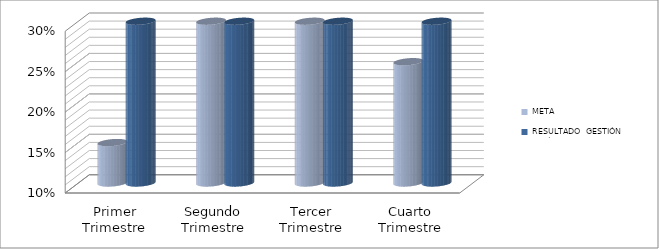
| Category | META | RESULTADO  GESTIÓN PERÍODO |
|---|---|---|
| Primer Trimestre | 0.15 | 1 |
| Segundo Trimestre | 0.3 | 1 |
| Tercer Trimestre | 0.3 | 1 |
| Cuarto Trimestre | 0.25 | 1 |